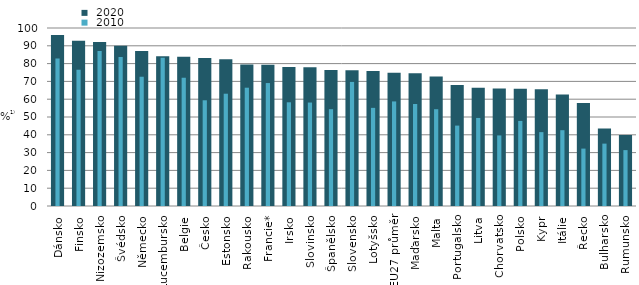
| Category |  2020 |
|---|---|
| Dánsko | 96 |
| Finsko | 92.9 |
| Nizozemsko | 92.1 |
| Švédsko | 90 |
| Německo | 87.1 |
| Lucembursko | 84.1 |
| Belgie | 83.8 |
| Česko | 83.2 |
| Estonsko | 82.4 |
| Rakousko | 79.5 |
| Francie* | 79.398 |
| Irsko | 78.1 |
| Slovinsko | 77.9 |
| Španělsko | 76.4 |
| Slovensko | 76.2 |
| Lotyšsko | 75.9 |
| EU27 průměr | 74.844 |
| Maďarsko | 74.6 |
| Malta | 72.7 |
| Portugalsko | 68 |
| Litva | 66.4 |
| Chorvatsko | 66 |
| Polsko | 65.9 |
| Kypr | 65.6 |
| Itálie | 62.7 |
| Řecko | 57.9 |
| Bulharsko | 43.5 |
| Rumunsko | 39.9 |